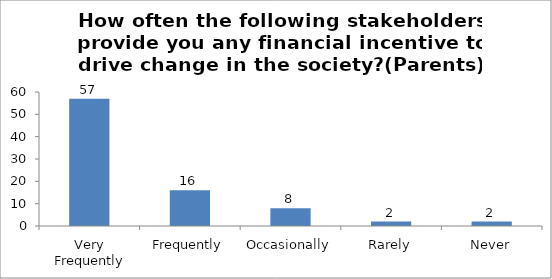
| Category | How often the following stakeholders provide you any financial incentive to drive change in the society?(Parents) |
|---|---|
| Very Frequently | 57 |
| Frequently | 16 |
| Occasionally | 8 |
| Rarely | 2 |
| Never | 2 |